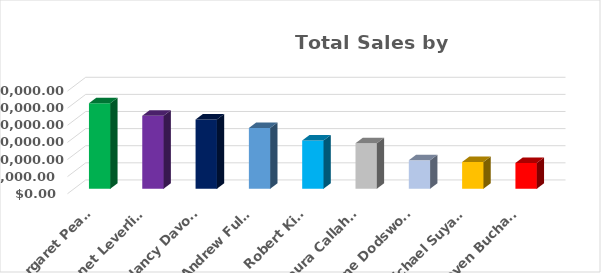
| Category | Total |
|---|---|
| Margaret Peacock | 250187.45 |
| Janet Leverling | 213051.3 |
| Nancy Davolio | 202143.71 |
| Andrew Fuller | 177749.26 |
| Robert King | 141295.99 |
| Laura Callahan | 133301.03 |
| Anne Dodsworth | 82964 |
| Michael Suyama | 78198.1 |
| Steven Buchanan | 75567.75 |